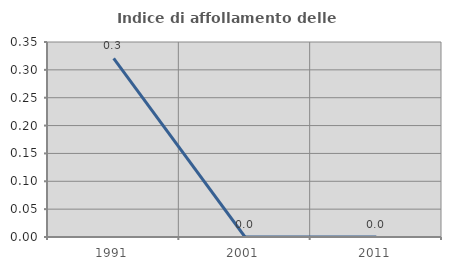
| Category | Indice di affollamento delle abitazioni  |
|---|---|
| 1991.0 | 0.321 |
| 2001.0 | 0 |
| 2011.0 | 0 |